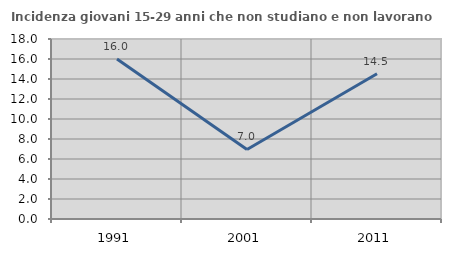
| Category | Incidenza giovani 15-29 anni che non studiano e non lavorano  |
|---|---|
| 1991.0 | 15.994 |
| 2001.0 | 6.952 |
| 2011.0 | 14.525 |